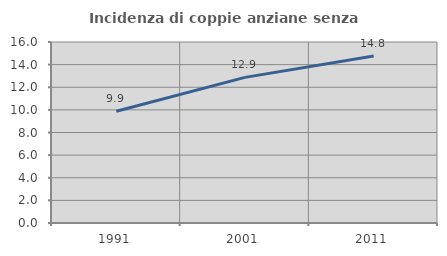
| Category | Incidenza di coppie anziane senza figli  |
|---|---|
| 1991.0 | 9.879 |
| 2001.0 | 12.874 |
| 2011.0 | 14.757 |